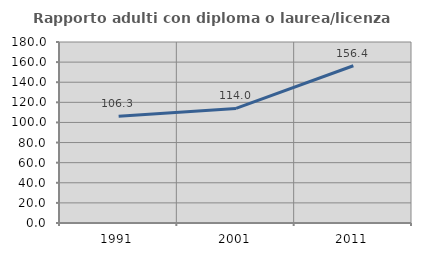
| Category | Rapporto adulti con diploma o laurea/licenza media  |
|---|---|
| 1991.0 | 106.28 |
| 2001.0 | 113.953 |
| 2011.0 | 156.371 |